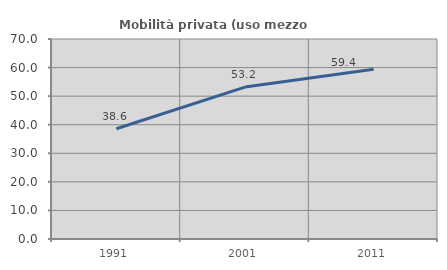
| Category | Mobilità privata (uso mezzo privato) |
|---|---|
| 1991.0 | 38.58 |
| 2001.0 | 53.164 |
| 2011.0 | 59.4 |